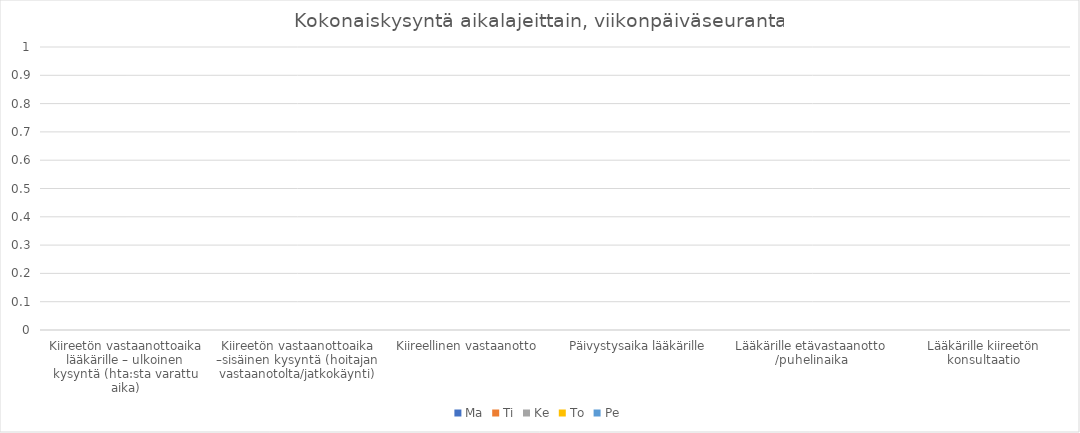
| Category | Ma | Ti | Ke | To | Pe |
|---|---|---|---|---|---|
| Kiireetön vastaanottoaika lääkärille – ulkoinen kysyntä (hta:sta varattu aika) | 0 | 0 | 0 | 0 | 0 |
| Kiireetön vastaanottoaika –sisäinen kysyntä (hoitajan vastaanotolta/jatkokäynti) | 0 | 0 | 0 | 0 | 0 |
| Kiireellinen vastaanotto | 0 | 0 | 0 | 0 | 0 |
| Päivystysaika lääkärille | 0 | 0 | 0 | 0 | 0 |
| Lääkärille etävastaanotto /puhelinaika | 0 | 0 | 0 | 0 | 0 |
| Lääkärille kiireetön konsultaatio | 0 | 0 | 0 | 0 | 0 |